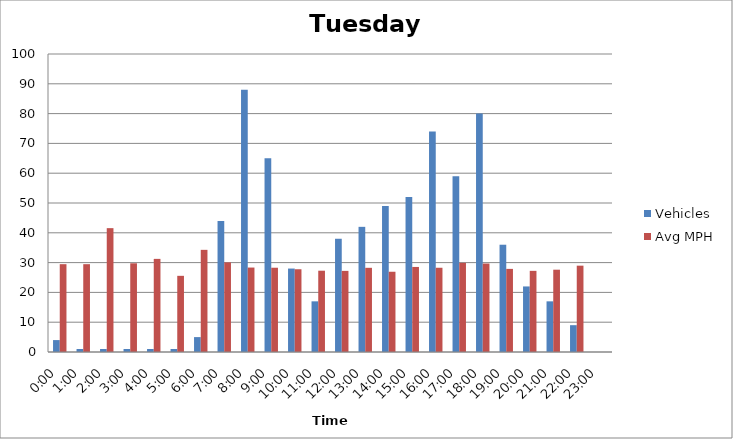
| Category | Vehicles | Avg MPH |
|---|---|---|
| 0:00 | 4 | 29.47 |
| 1:00 | 1 | 29.47 |
| 2:00 | 1 | 41.56 |
| 3:00 | 1 | 29.77 |
| 4:00 | 1 | 31.25 |
| 5:00 | 1 | 25.56 |
| 6:00 | 5 | 34.28 |
| 7:00 | 44 | 30.07 |
| 8:00 | 88 | 28.34 |
| 9:00 | 65 | 28.28 |
| 10:00 | 28 | 27.77 |
| 11:00 | 17 | 27.28 |
| 12:00 | 38 | 27.22 |
| 13:00 | 42 | 28.25 |
| 14:00 | 49 | 26.93 |
| 15:00 | 52 | 28.54 |
| 16:00 | 74 | 28.27 |
| 17:00 | 59 | 29.92 |
| 18:00 | 80 | 29.69 |
| 19:00 | 36 | 27.89 |
| 20:00 | 22 | 27.23 |
| 21:00 | 17 | 27.62 |
| 22:00 | 9 | 28.97 |
| 23:00 | 0 | 0 |